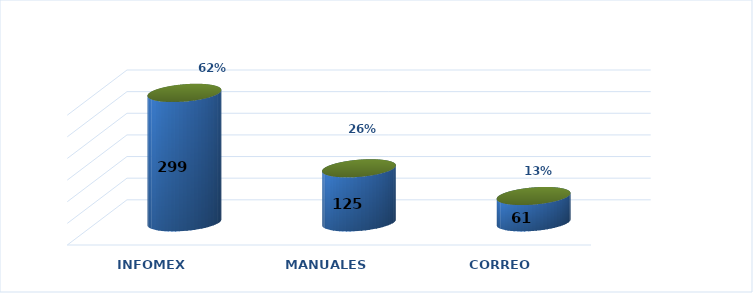
| Category | Series 0 | Series 1 |
|---|---|---|
| INFOMEX | 299 | 0.616 |
| MANUALES | 125 | 0.258 |
| CORREO | 61 | 0.126 |